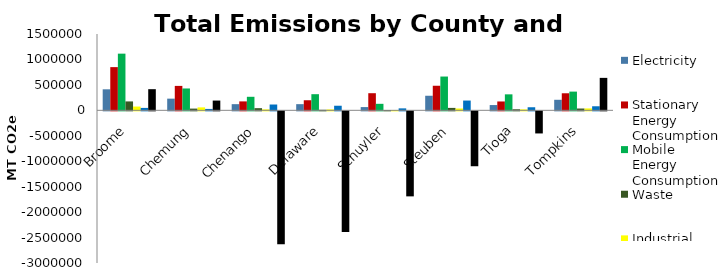
| Category | Electricity | Stationary Energy Consumption | Mobile Energy Consumption | Waste | Industrial Processes | Agriculture | LULUCF |
|---|---|---|---|---|---|---|---|
| Broome | 413119.253 | 849133.678 | 1113793.058 | 175148.18 | 74458.598 | 47684.949 | 415668.002 |
| Chemung | 229614.791 | 480217.335 | 429744.921 | 34073.695 | 58124.371 | 27598.663 | 192002.682 |
| Chenango | 121263.037 | 175679.459 | 266071.309 | 42559.109 | 18736.025 | 114366.666 | -2612112.945 |
| Delaware | 121380.246 | 198143.069 | 317300.15 | 10609.131 | 17809.19 | 90368.517 | -2371520.712 |
| Schuyler | 63811.463 | 336576.027 | 128015.308 | 6254.176 | 6808.545 | 38648.494 | -1670943.737 |
| Steuben | 286554.041 | 483033.209 | 664109.524 | 47799.106 | 35969.145 | 192276.022 | -1078994.813 |
| Tioga | 103778.995 | 174222.686 | 314331.002 | 21001.016 | 18976.55 | 60525.82 | -434566.982 |
| Tompkins | 207226.414 | 335270.119 | 367986.337 | 35538.081 | 37698.47 | 79919.437 | 637963.832 |